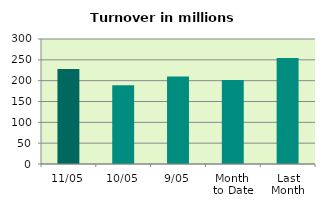
| Category | Series 0 |
|---|---|
| 11/05 | 227.902 |
| 10/05 | 189.187 |
| 9/05 | 210.299 |
| Month 
to Date | 201.746 |
| Last
Month | 254.458 |